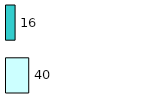
| Category | Series 0 | Series 1 |
|---|---|---|
| 0 | 40 | 16 |